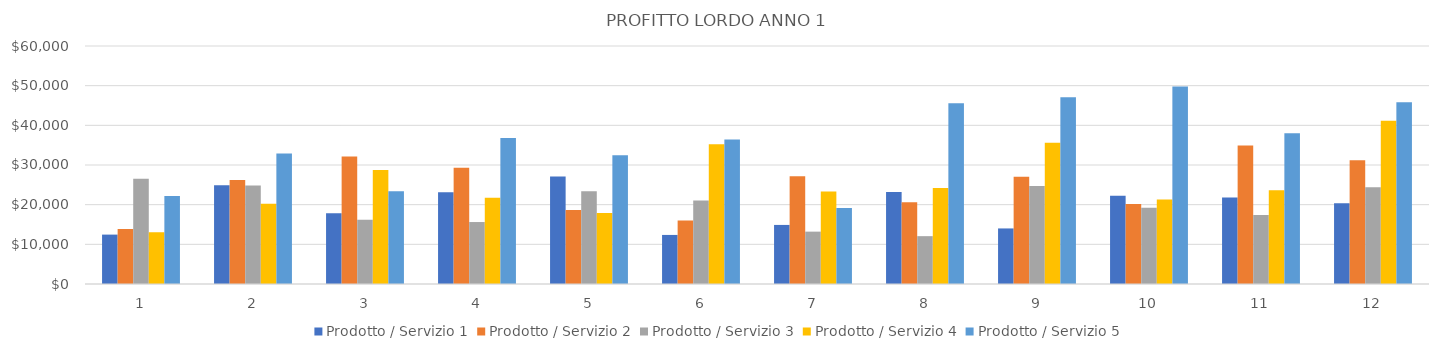
| Category | Prodotto / Servizio 1 | Prodotto / Servizio 2 | Prodotto / Servizio 3 | Prodotto / Servizio 4 | Prodotto / Servizio 5 |
|---|---|---|---|---|---|
| 0 | 12453 | 13896 | 26541 | 13024 | 22200 |
| 1 | 24899 | 26232 | 24858 | 20218 | 32880 |
| 2 | 17822 | 32152 | 16218 | 28743 | 23385 |
| 3 | 23107.5 | 29287.5 | 15623 | 21766.5 | 36815.5 |
| 4 | 27131 | 18660 | 23400.5 | 17871 | 32465.5 |
| 5 | 12369.5 | 15982.5 | 21063 | 35238 | 36438.5 |
| 6 | 14891.5 | 27142.5 | 13200.5 | 23331 | 19140 |
| 7 | 23211.5 | 20602.5 | 12061.5 | 24202.5 | 45559 |
| 8 | 14007.5 | 27052.5 | 24726.5 | 35595 | 47052.5 |
| 9 | 22218 | 20160 | 19233 | 21329 | 49770 |
| 10 | 21780 | 34920 | 17376 | 23647 | 38000 |
| 11 | 20340 | 31170 | 24420 | 41158 | 45840 |